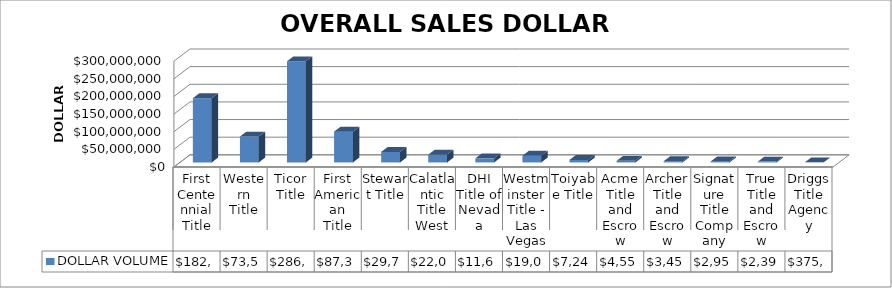
| Category | DOLLAR VOLUME |
|---|---|
| First Centennial Title | 182231017 |
| Western Title | 73511207 |
| Ticor Title | 286871773 |
| First American Title | 87300549.99 |
| Stewart Title | 29736900 |
| Calatlantic Title West | 22035951 |
| DHI Title of Nevada | 11653340 |
| Westminster Title - Las Vegas | 19079608 |
| Toiyabe Title | 7247350 |
| Acme Title and Escrow | 4556000 |
| Archer Title and Escrow | 3458500 |
| Signature Title Company | 2955500 |
| True Title and Escrow | 2399000 |
| Driggs Title Agency | 375000 |